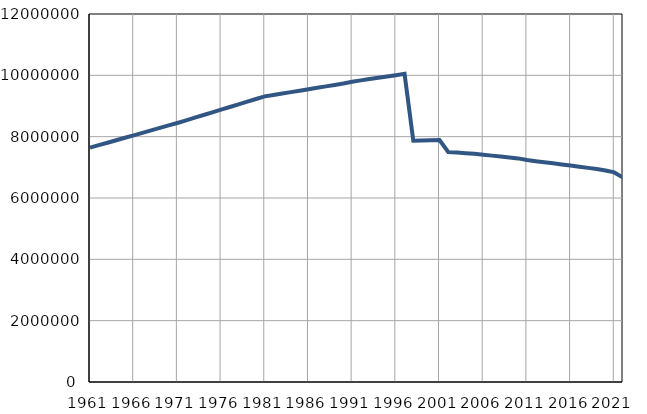
| Category | Број
становника |
|---|---|
| 1961.0 | 7641962 |
| 1962.0 | 7722440 |
| 1963.0 | 7802916 |
| 1964.0 | 7883392 |
| 1965.0 | 7963870 |
| 1966.0 | 8044352 |
| 1967.0 | 8124823 |
| 1968.0 | 8205302 |
| 1969.0 | 8285777 |
| 1970.0 | 8366253 |
| 1971.0 | 8446726 |
| 1972.0 | 8533427 |
| 1973.0 | 8620128 |
| 1974.0 | 8706830 |
| 1975.0 | 8793530 |
| 1976.0 | 8880239 |
| 1977.0 | 8966931 |
| 1978.0 | 9053636 |
| 1979.0 | 9140333 |
| 1980.0 | 9227037 |
| 1981.0 | 9313686 |
| 1982.0 | 9360219 |
| 1983.0 | 9406748 |
| 1984.0 | 9453281 |
| 1985.0 | 9499808 |
| 1986.0 | 9546347 |
| 1987.0 | 9592873 |
| 1988.0 | 9639402 |
| 1989.0 | 9685933 |
| 1990.0 | 9732464 |
| 1991.0 | 9789795 |
| 1992.0 | 9835190 |
| 1993.0 | 9878582 |
| 1994.0 | 9918975 |
| 1995.0 | 9961370 |
| 1996.0 | 10005763 |
| 1997.0 | 10047159 |
| 1998.0 | 7867551 |
| 1999.0 | 7873944 |
| 2000.0 | 7880338 |
| 2001.0 | 7886732 |
| 2002.0 | 7500031 |
| 2003.0 | 7480591 |
| 2004.0 | 7463157 |
| 2005.0 | 7440769 |
| 2006.0 | 7411569 |
| 2007.0 | 7381579 |
| 2008.0 | 7350222 |
| 2009.0 | 7320807 |
| 2010.0 | 7291436 |
| 2011.0 | 7236519 |
| 2012.0 | 7201497 |
| 2013.0 | 7166552 |
| 2014.0 | 7131787 |
| 2015.0 | 7095383 |
| 2016.0 | 7058322 |
| 2017.0 | 7020858 |
| 2018.0 | 6982604 |
| 2019.0 | 6945235 |
| 2020.0 | 6899126 |
| 2021.0 | 6834326 |
| 2022.0 | 6664449 |